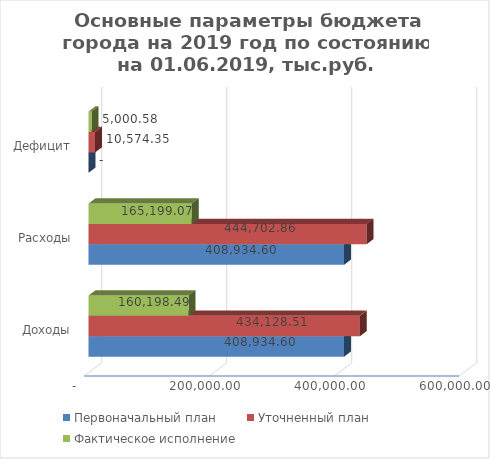
| Category | Первоначальный план | Уточненный план | Фактическое исполнение |
|---|---|---|---|
| Доходы | 408934.598 | 434128.512 | 160198.489 |
| Расходы | 408934.598 | 444702.86 | 165199.074 |
| Дефицит | 0 | 10574.348 | 5000.585 |